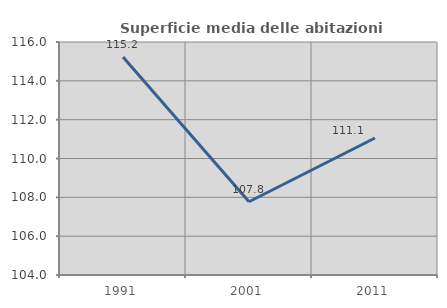
| Category | Superficie media delle abitazioni occupate |
|---|---|
| 1991.0 | 115.224 |
| 2001.0 | 107.772 |
| 2011.0 | 111.055 |